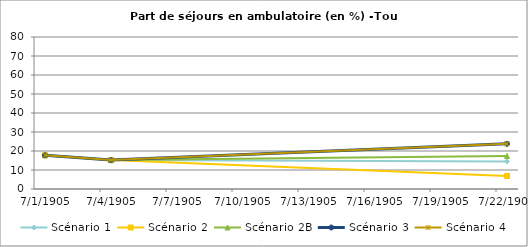
| Category | Scénario 1 | Scénario 2 | Scénario 2B | Scénario 3 | Scénario 4 |
|---|---|---|---|---|---|
| 2009.0 | 17.756 | 17.756 | 17.756 | 17.756 | 17.756 |
| 2012.0 | 15.21 | 15.21 | 15.21 | 15.21 | 15.21 |
| 2030.0 | 14.515 | 6.881 | 17.409 | 23.777 | 23.777 |